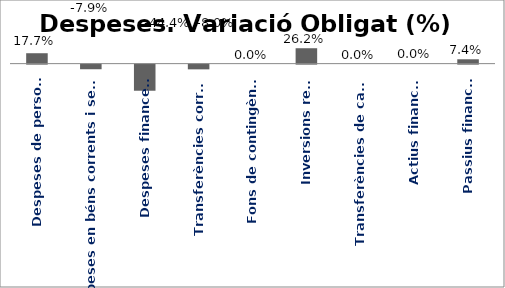
| Category | Series 0 |
|---|---|
| Despeses de personal | 0.177 |
| Despeses en béns corrents i serveis | -0.079 |
| Despeses financeres | -0.444 |
| Transferències corrents | -0.08 |
| Fons de contingència | 0 |
| Inversions reals | 0.262 |
| Transferències de capital | 0 |
| Actius financers | 0 |
| Passius financers | 0.074 |